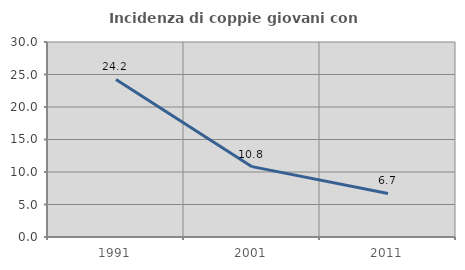
| Category | Incidenza di coppie giovani con figli |
|---|---|
| 1991.0 | 24.242 |
| 2001.0 | 10.825 |
| 2011.0 | 6.701 |